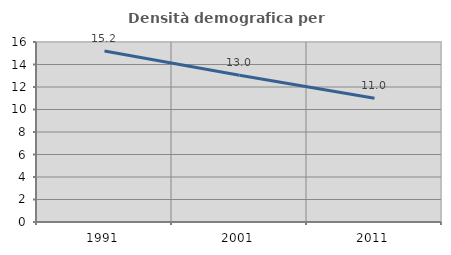
| Category | Densità demografica |
|---|---|
| 1991.0 | 15.192 |
| 2001.0 | 13.047 |
| 2011.0 | 10.995 |